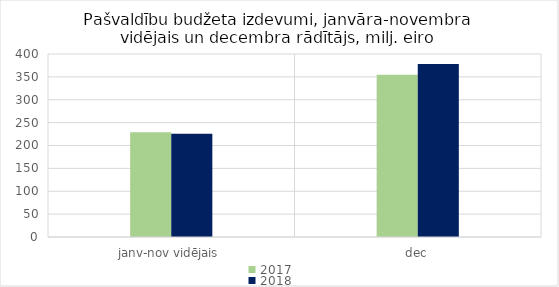
| Category | 2017 | 2018 |
|---|---|---|
| janv-nov vidējais | 228773.382 | 225428.083 |
| dec | 354571.434 | 378007.978 |